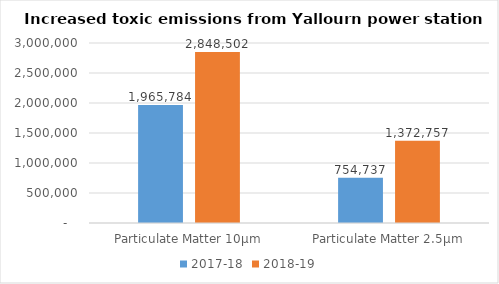
| Category | 2017-18 | 2018-19 |
|---|---|---|
| Particulate Matter 10μm | 1965784 | 2848502 |
| Particulate Matter 2.5μm | 754737 | 1372757 |